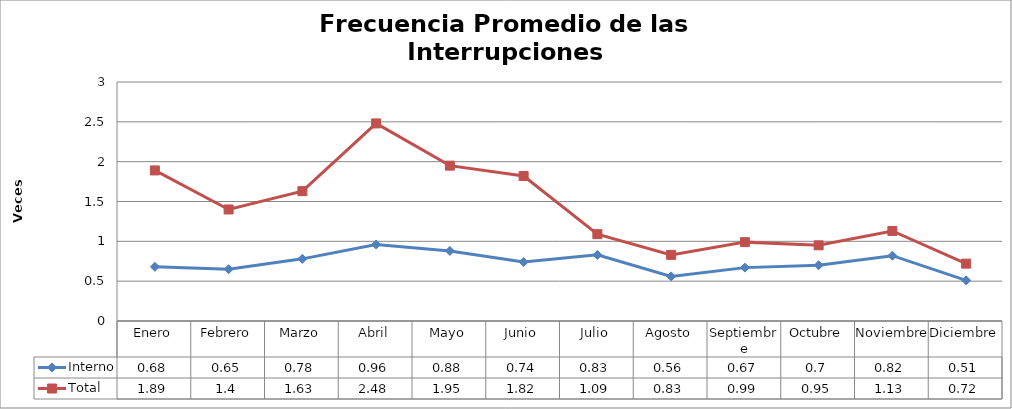
| Category | Interno | Total |
|---|---|---|
| Enero | 0.68 | 1.89 |
| Febrero | 0.65 | 1.4 |
| Marzo | 0.78 | 1.63 |
| Abril | 0.96 | 2.48 |
| Mayo | 0.88 | 1.95 |
| Junio | 0.74 | 1.82 |
| Julio | 0.83 | 1.09 |
| Agosto | 0.56 | 0.83 |
| Septiembre | 0.67 | 0.99 |
| Octubre | 0.7 | 0.95 |
| Noviembre | 0.82 | 1.13 |
| Diciembre | 0.51 | 0.72 |